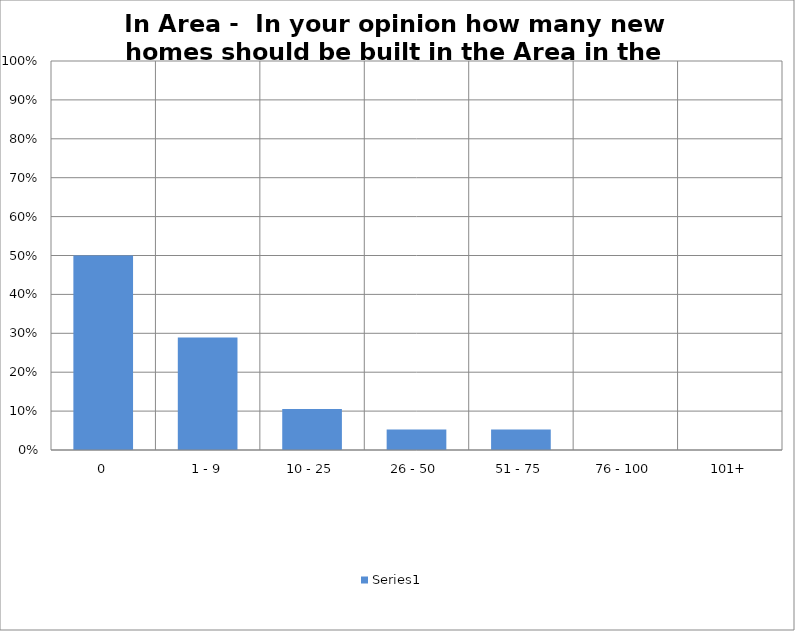
| Category | Series 11 |
|---|---|
| 0 | 0.5 |
| 1 - 9 | 0.289 |
| 10 - 25 | 0.105 |
| 26 - 50 | 0.053 |
| 51 - 75 | 0.053 |
| 76 - 100 | 0 |
| 101+ | 0 |